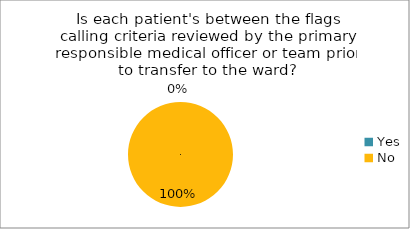
| Category | Is each patient's between the flags calling criteria reviewed by the primary responsible medical officer or team prior to transfer to the ward? | Is each patient's escalation of care plan reviewed  by the primary responsible medical officer or team prior to transfer to the ward? | Is each patient's management plans documented daily by the admitting medical officer? | Is medical handover documented at transfer of care using a formalised process? | Is nursing handover documented at transfer of care using a formalised process? |
|---|---|---|---|---|---|
| Yes | 0 | 0.1 | 0 | 0 | 0 |
| No | 1 | 1 | 1 | 1 | 1 |